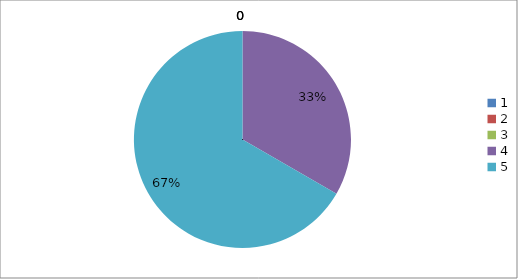
| Category | Series 0 |
|---|---|
| 0 | 0 |
| 1 | 0 |
| 2 | 0 |
| 3 | 0.333 |
| 4 | 0.667 |